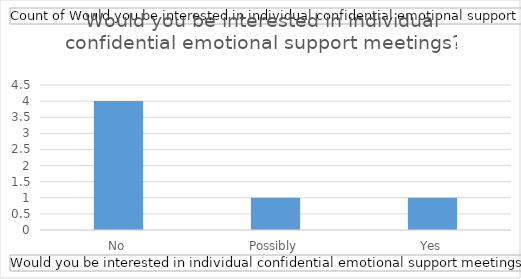
| Category | Total |
|---|---|
| No | 4 |
| Possibly | 1 |
| Yes | 1 |